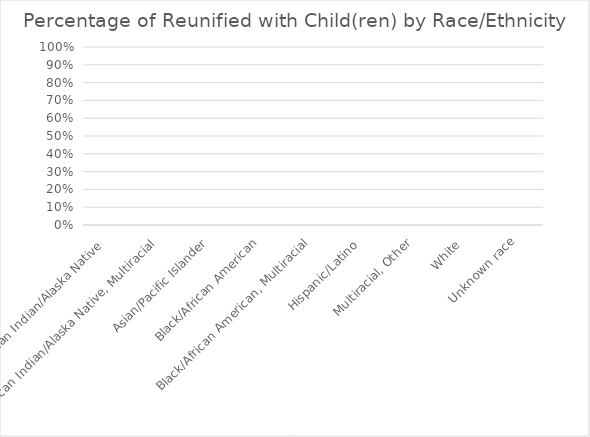
| Category | % of Reunified |
|---|---|
| American Indian/Alaska Native  | 0 |
| American Indian/Alaska Native, Multiracial | 0 |
| Asian/Pacific Islander | 0 |
| Black/African American | 0 |
| Black/African American, Multiracial | 0 |
| Hispanic/Latino  | 0 |
| Multiracial, Other | 0 |
| White  | 0 |
| Unknown race | 0 |